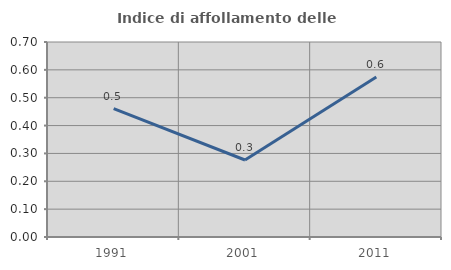
| Category | Indice di affollamento delle abitazioni  |
|---|---|
| 1991.0 | 0.461 |
| 2001.0 | 0.276 |
| 2011.0 | 0.574 |